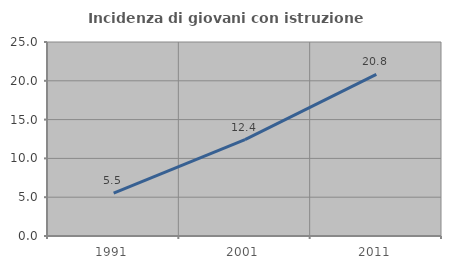
| Category | Incidenza di giovani con istruzione universitaria |
|---|---|
| 1991.0 | 5.53 |
| 2001.0 | 12.431 |
| 2011.0 | 20.827 |